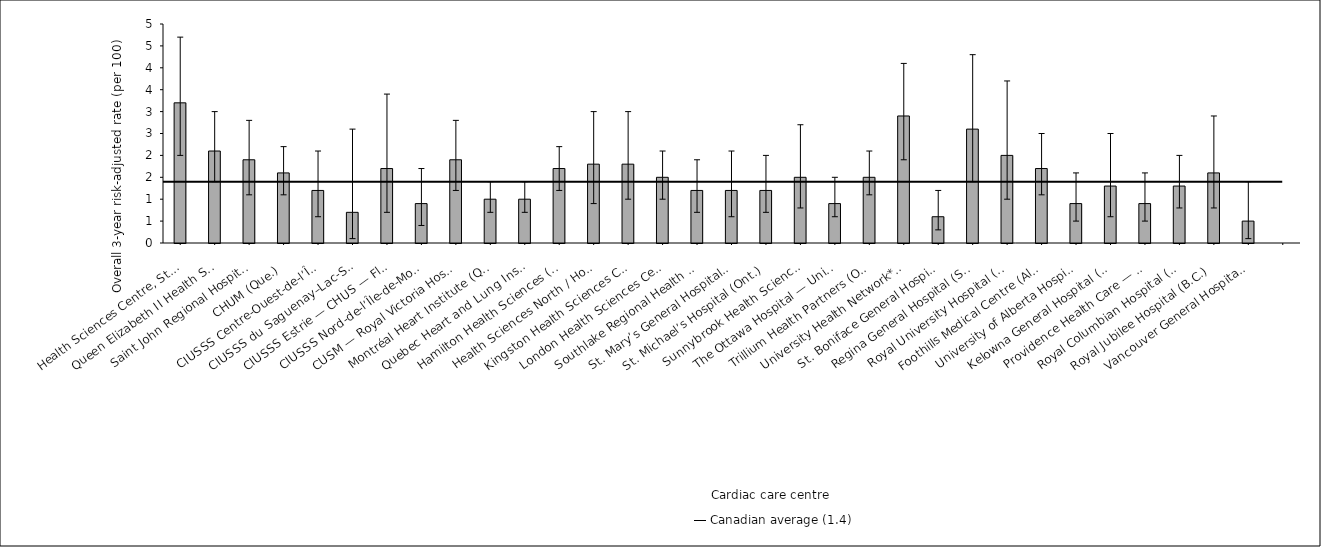
| Category | Risk-adjusted rate |
|---|---|
| Health Sciences Centre, St. John’s* (N.L.) | 3.2 |
| Queen Elizabeth II Health Sciences Centre (N.S.) | 2.1 |
| Saint John Regional Hospital (N.B.) | 1.9 |
| CHUM (Que.) | 1.6 |
| CIUSSS Centre-Ouest-de-l’Île-de-Montréal — Jewish General Hospital (Que.) | 1.2 |
| CIUSSS du Saguenay–Lac-St-Jean — Chicoutimi Hospital (Que.) | 0.7 |
| CIUSSS Estrie — CHUS — Fleurimont Hospital (Que.) | 1.7 |
| CIUSSS Nord-de-l’Île-de-Montréal — Montréal Sacré-Coeur Hospital (Que.) | 0.9 |
| CUSM — Royal Victoria Hospital (Que.) | 1.9 |
| Montréal Heart Institute (Que.) | 1 |
| Quebec Heart and Lung Institute (Que.) | 1 |
| Hamilton Health Sciences (Ont.) | 1.7 |
| Health Sciences North / Horizon Santé-Nord (Ont.) | 1.8 |
| Kingston Health Sciences Centre (Ont.) | 1.8 |
| London Health Sciences Centre (Ont.) | 1.5 |
| Southlake Regional Health Centre (Ont.) | 1.2 |
| St. Mary’s General Hospital (Ont.) | 1.2 |
| St. Michael’s Hospital (Ont.) | 1.2 |
| Sunnybrook Health Sciences Centre (Ont.) | 1.5 |
| The Ottawa Hospital — University of Ottawa Heart Institute (Ont.) | 0.9 |
| Trillium Health Partners (Ont.) | 1.5 |
| University Health Network* (Ont.) | 2.9 |
| St. Boniface General Hospital* (Man.) | 0.6 |
| Regina General Hospital (Sask.) | 2.6 |
| Royal University Hospital (Sask.) | 2 |
| Foothills Medical Centre (Alta.) | 1.7 |
| University of Alberta Hospital (Alta.) | 0.9 |
| Kelowna General Hospital (B.C.) | 1.3 |
| Providence Health Care — St. Paul’s Hospital (Vancouver) (B.C.) | 0.9 |
| Royal Columbian Hospital (B.C.) | 1.3 |
| Royal Jubilee Hospital (B.C.) | 1.6 |
| Vancouver General Hospital (B.C.) | 0.5 |